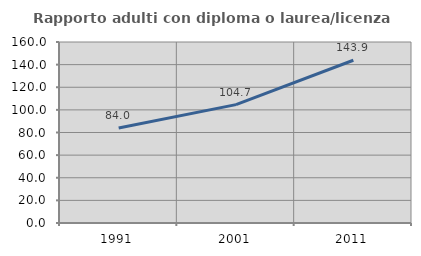
| Category | Rapporto adulti con diploma o laurea/licenza media  |
|---|---|
| 1991.0 | 84 |
| 2001.0 | 104.651 |
| 2011.0 | 143.882 |